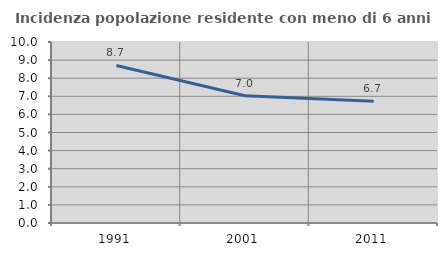
| Category | Incidenza popolazione residente con meno di 6 anni |
|---|---|
| 1991.0 | 8.705 |
| 2001.0 | 7.035 |
| 2011.0 | 6.731 |